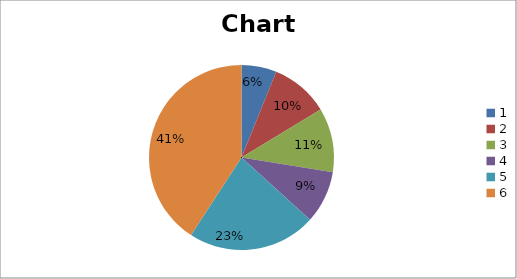
| Category | Series 0 |
|---|---|
| 0 | 30 |
| 1 | 50 |
| 2 | 55 |
| 3 | 45 |
| 4 | 110 |
| 5 | 200 |